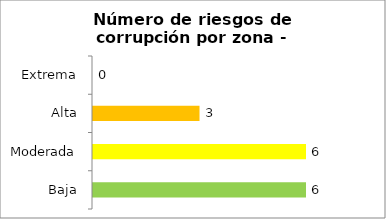
| Category | Series 0 |
|---|---|
| Baja | 6 |
| Moderada | 6 |
| Alta | 3 |
| Extrema | 0 |